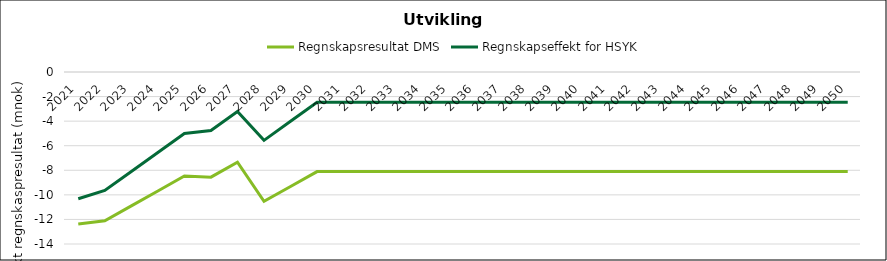
| Category | Regnskapsresultat DMS | Regnskapseffekt for HSYK |
|---|---|---|
| 2021.0 | -12.373 | -10.313 |
| 2022.0 | -12.107 | -9.644 |
| 2023.0 | -10.894 | -8.101 |
| 2024.0 | -9.681 | -6.556 |
| 2025.0 | -8.467 | -5.008 |
| 2026.0 | -8.559 | -4.765 |
| 2027.0 | -7.346 | -3.215 |
| 2028.0 | -10.532 | -5.564 |
| 2029.0 | -9.318 | -4.014 |
| 2030.0 | -8.105 | -2.464 |
| 2031.0 | -8.105 | -2.464 |
| 2032.0 | -8.105 | -2.464 |
| 2033.0 | -8.105 | -2.464 |
| 2034.0 | -8.105 | -2.464 |
| 2035.0 | -8.105 | -2.464 |
| 2036.0 | -8.105 | -2.464 |
| 2037.0 | -8.105 | -2.464 |
| 2038.0 | -8.105 | -2.464 |
| 2039.0 | -8.105 | -2.464 |
| 2040.0 | -8.105 | -2.464 |
| 2041.0 | -8.105 | -2.464 |
| 2042.0 | -8.105 | -2.464 |
| 2043.0 | -8.105 | -2.464 |
| 2044.0 | -8.105 | -2.464 |
| 2045.0 | -8.105 | -2.464 |
| 2046.0 | -8.105 | -2.464 |
| 2047.0 | -8.105 | -2.464 |
| 2048.0 | -8.105 | -2.464 |
| 2049.0 | -8.105 | -2.464 |
| 2050.0 | -8.105 | -2.464 |